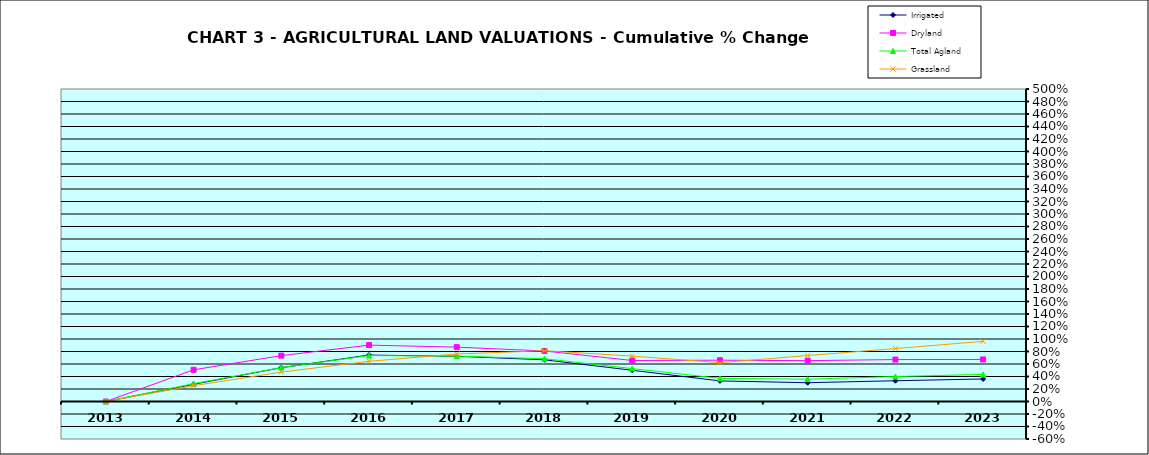
| Category | Irrigated | Dryland | Total Agland | Grassland |
|---|---|---|---|---|
| 2013.0 | 0 | 0 | 0 | 0 |
| 2014.0 | 0.276 | 0.507 | 0.285 | 0.253 |
| 2015.0 | 0.541 | 0.734 | 0.542 | 0.47 |
| 2016.0 | 0.743 | 0.902 | 0.735 | 0.643 |
| 2017.0 | 0.723 | 0.87 | 0.727 | 0.76 |
| 2018.0 | 0.667 | 0.808 | 0.684 | 0.813 |
| 2019.0 | 0.5 | 0.656 | 0.527 | 0.727 |
| 2020.0 | 0.329 | 0.661 | 0.37 | 0.622 |
| 2021.0 | 0.301 | 0.653 | 0.357 | 0.735 |
| 2022.0 | 0.332 | 0.671 | 0.399 | 0.847 |
| 2023.0 | 0.361 | 0.673 | 0.434 | 0.962 |